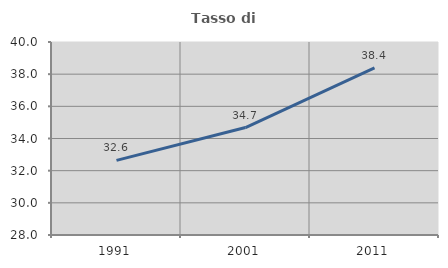
| Category | Tasso di occupazione   |
|---|---|
| 1991.0 | 32.638 |
| 2001.0 | 34.683 |
| 2011.0 | 38.385 |